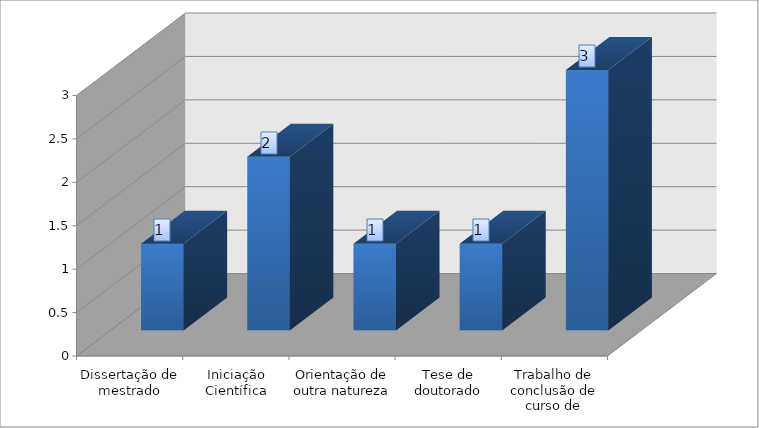
| Category | Total de produções |
|---|---|
| Dissertação de mestrado | 1 |
| Iniciação Científica | 2 |
| Orientação de outra natureza | 1 |
| Tese de doutorado | 1 |
| Trabalho de conclusão de curso de graduação | 3 |